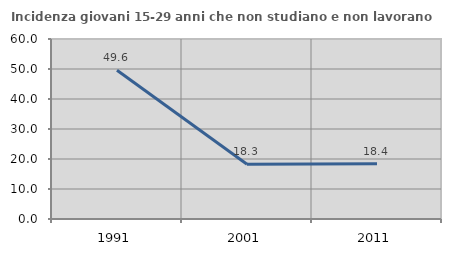
| Category | Incidenza giovani 15-29 anni che non studiano e non lavorano  |
|---|---|
| 1991.0 | 49.565 |
| 2001.0 | 18.257 |
| 2011.0 | 18.436 |